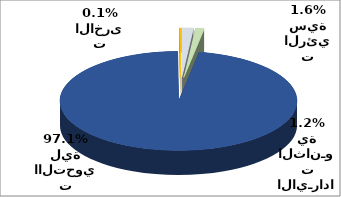
| Category | Series 0 |
|---|---|
| الايرادات الرئيسية | 67736012 |
| الايـرادات الثانـوية | 51338793 |
| الايرادات االتحويلية | 4193095920 |
| الايرادات الاخرى | 5604689 |